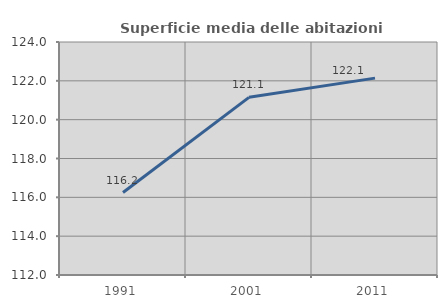
| Category | Superficie media delle abitazioni occupate |
|---|---|
| 1991.0 | 116.247 |
| 2001.0 | 121.15 |
| 2011.0 | 122.139 |